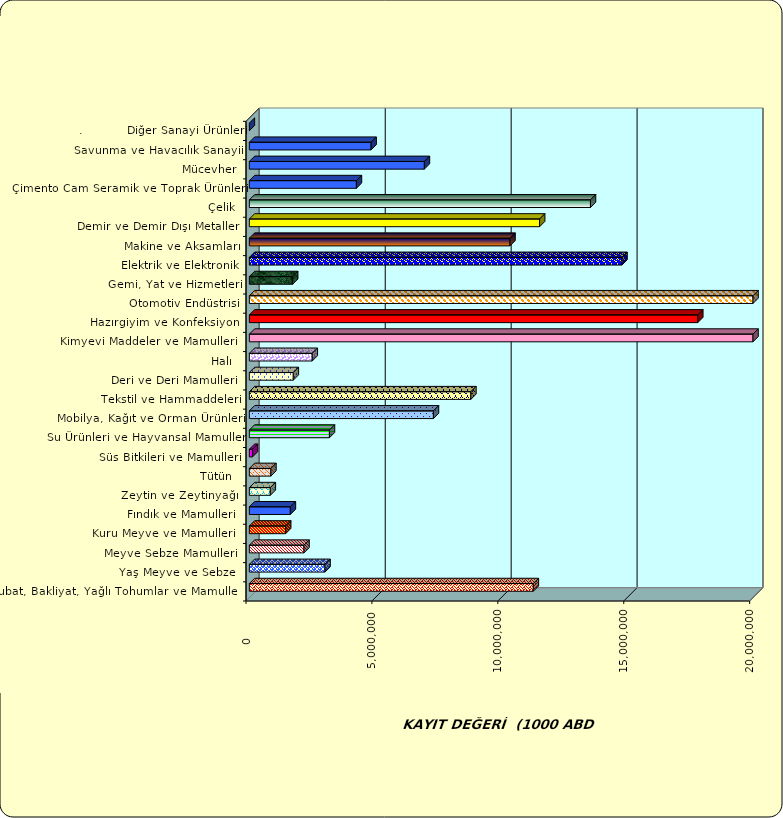
| Category | Series 0 |
|---|---|
|  Hububat, Bakliyat, Yağlı Tohumlar ve Mamulleri  | 11275992.186 |
|  Yaş Meyve ve Sebze   | 3004737.497 |
|  Meyve Sebze Mamulleri  | 2169755.468 |
|  Kuru Meyve ve Mamulleri   | 1441404.971 |
|  Fındık ve Mamulleri  | 1628308.777 |
|  Zeytin ve Zeytinyağı  | 832744.422 |
|  Tütün  | 855419.066 |
|  Süs Bitkileri ve Mamulleri | 123327.644 |
|  Su Ürünleri ve Hayvansal Mamuller | 3180606.995 |
|  Mobilya, Kağıt ve Orman Ürünleri | 7309598.793 |
|  Tekstil ve Hammaddeleri | 8795889.846 |
|  Deri ve Deri Mamulleri  | 1745526.999 |
|  Halı  | 2497628.982 |
|  Kimyevi Maddeler ve Mamulleri   | 27862297.136 |
|  Hazırgiyim ve Konfeksiyon  | 17805405.098 |
|  Otomotiv Endüstrisi | 31830991.156 |
|  Gemi, Yat ve Hizmetleri | 1718424.547 |
|  Elektrik ve Elektronik | 14797032.223 |
|  Makine ve Aksamları | 10349358.435 |
|  Demir ve Demir Dışı Metaller  | 11525651.875 |
|  Çelik | 13545378.177 |
|  Çimento Cam Seramik ve Toprak Ürünleri | 4250978.085 |
|  Mücevher | 6949867.733 |
|  Savunma ve Havacılık Sanayii | 4834306.901 |
| .           Diğer Sanayi Ürünleri | 0 |